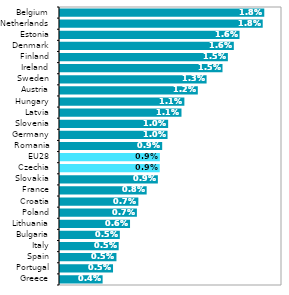
| Category | 2018* |
|---|---|
| Greece | 0.004 |
| Portugal | 0.005 |
| Spain | 0.005 |
| Italy | 0.005 |
| Bulgaria | 0.005 |
| Lithuania | 0.006 |
| Poland | 0.007 |
| Croatia | 0.007 |
| France | 0.008 |
| Slovakia | 0.009 |
| Czechia | 0.009 |
| EU28 | 0.009 |
| Romania | 0.009 |
| Germany | 0.01 |
| Slovenia | 0.01 |
| Latvia | 0.011 |
| Hungary | 0.011 |
| Austria | 0.012 |
| Sweden | 0.013 |
| Ireland | 0.015 |
| Finland | 0.015 |
| Denmark | 0.016 |
| Estonia | 0.016 |
| Netherlands | 0.018 |
| Belgium | 0.018 |